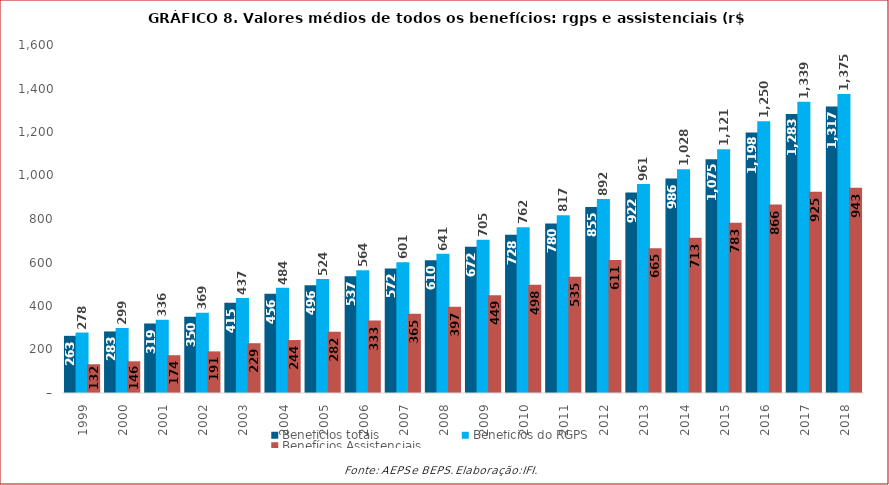
| Category | Benefícios totais | Benefícios do RGPS | Benefícios Assistenciais |
|---|---|---|---|
| 1999.0 | 262.841 | 277.812 | 132.273 |
| 2000.0 | 283.059 | 299.054 | 145.706 |
| 2001.0 | 319.183 | 336.259 | 173.759 |
| 2002.0 | 350.469 | 369.467 | 191.309 |
| 2003.0 | 414.781 | 436.963 | 228.975 |
| 2004.0 | 456.294 | 483.567 | 243.514 |
| 2005.0 | 495.585 | 523.824 | 281.676 |
| 2006.0 | 536.754 | 564.126 | 332.886 |
| 2007.0 | 572.44 | 601.288 | 364.726 |
| 2008.0 | 609.855 | 640.539 | 396.898 |
| 2009.0 | 671.902 | 704.806 | 449.159 |
| 2010.0 | 727.686 | 762.24 | 497.867 |
| 2011.0 | 779.591 | 816.915 | 534.665 |
| 2012.0 | 855.019 | 892.392 | 610.938 |
| 2013.0 | 921.81 | 961.292 | 665.09 |
| 2014.0 | 986.167 | 1028.343 | 713.243 |
| 2015.0 | 1075.09 | 1120.531 | 782.585 |
| 2016.0 | 1197.975 | 1249.583 | 866.391 |
| 2017.0 | 1283.034 | 1339.046 | 925.145 |
| 2018.0 | 1316.727 | 1375.028 | 943.407 |